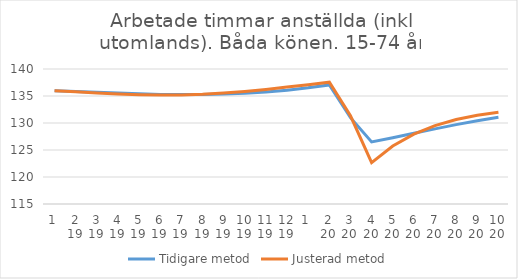
| Category | Tidigare metod | Justerad metod |
|---|---|---|
| 0 | 135.99 | 135.99 |
| 1 | 135.85 | 135.77 |
| 2 | 135.7 | 135.56 |
| 3 | 135.54 | 135.37 |
| 4 | 135.4 | 135.23 |
| 5 | 135.3 | 135.17 |
| 6 | 135.26 | 135.2 |
| 7 | 135.28 | 135.32 |
| 8 | 135.36 | 135.54 |
| 9 | 135.51 | 135.84 |
| 10 | 135.74 | 136.22 |
| 11 | 136.07 | 136.65 |
| 12 | 136.51 | 137.1 |
| 13 | 137.05 | 137.56 |
| 14 | 130.99 | 131.34 |
| 15 | 126.49 | 122.65 |
| 16 | 127.28 | 125.73 |
| 17 | 128.09 | 127.94 |
| 18 | 128.91 | 129.52 |
| 19 | 129.7 | 130.65 |
| 20 | 130.42 | 131.45 |
| 21 | 131.05 | 132.01 |